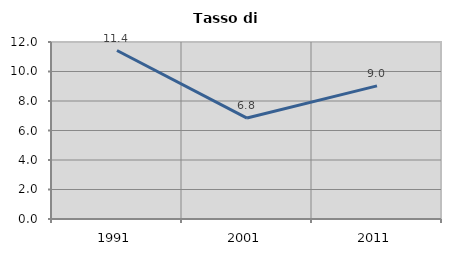
| Category | Tasso di disoccupazione   |
|---|---|
| 1991.0 | 11.423 |
| 2001.0 | 6.844 |
| 2011.0 | 9.027 |